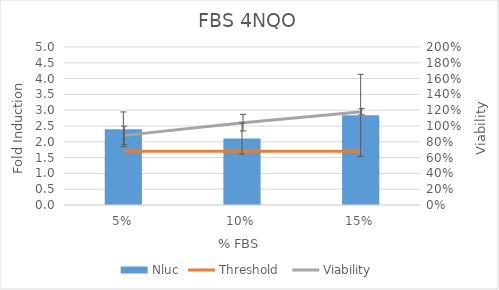
| Category | Nluc |
|---|---|
| 0.05 | 2.394 |
| 0.1 | 2.105 |
| 0.15 | 2.837 |